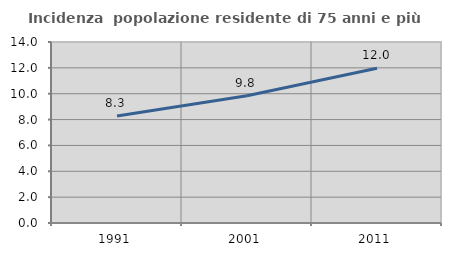
| Category | Incidenza  popolazione residente di 75 anni e più |
|---|---|
| 1991.0 | 8.269 |
| 2001.0 | 9.842 |
| 2011.0 | 11.965 |